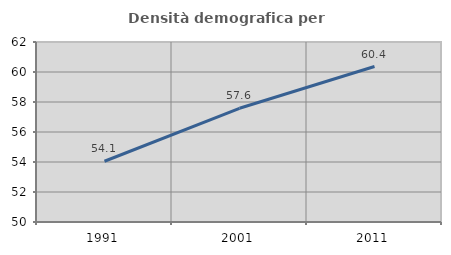
| Category | Densità demografica |
|---|---|
| 1991.0 | 54.051 |
| 2001.0 | 57.58 |
| 2011.0 | 60.366 |